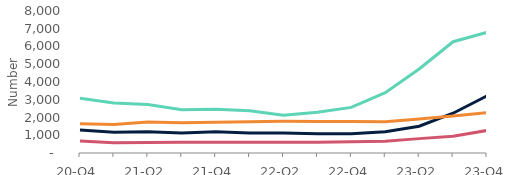
| Category | Arrears of 2.5%-5% of balance | Arrears of 5%-7.5% of balance | Arrears of 7.5%-10% of balance | Arrears over 10% of balance |
|---|---|---|---|---|
| 20-Q4 | 3090 | 1290 | 670 | 1650 |
| 21-Q1 | 2820 | 1170 | 580 | 1610 |
| 21-Q2 | 2730 | 1200 | 590 | 1740 |
| 21-Q3 | 2440 | 1130 | 610 | 1700 |
| 21-Q4 | 2470 | 1200 | 610 | 1730 |
| 22-Q1 | 2380 | 1130 | 600 | 1760 |
| 22-Q2 | 2130 | 1120 | 600 | 1790 |
| 22-Q3 | 2290 | 1090 | 600 | 1780 |
| 22-Q4 | 2570 | 1080 | 640 | 1770 |
| 23-Q1 | 3400 | 1200 | 660 | 1760 |
| 23-Q2 | 4730 | 1510 | 810 | 1910 |
| 23-Q3 | 6270 | 2240 | 950 | 2080 |
| 23-Q4 | 6800 | 3220 | 1270 | 2280 |